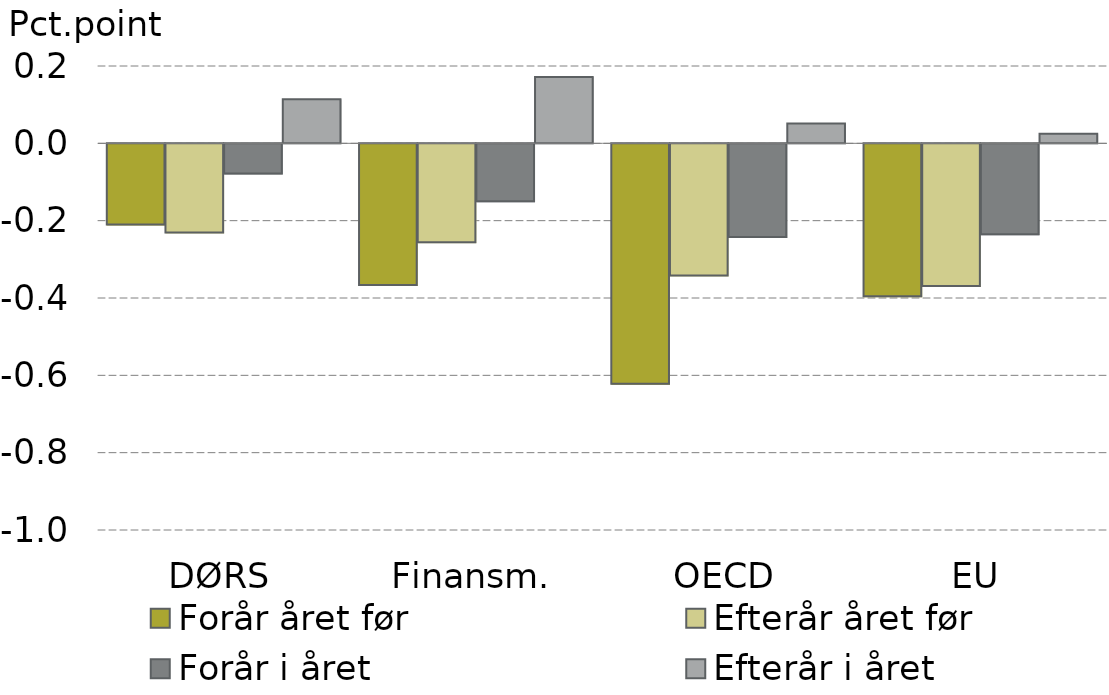
| Category | Forår året før | Efterår året før | Forår i året | Efterår i året |
|---|---|---|---|---|
| DØRS | -0.21 | -0.231 | -0.078 | 0.114 |
| Finansm. | -0.367 | -0.256 | -0.15 | 0.172 |
| OECD | -0.622 | -0.342 | -0.242 | 0.051 |
| EU | -0.395 | -0.369 | -0.235 | 0.025 |